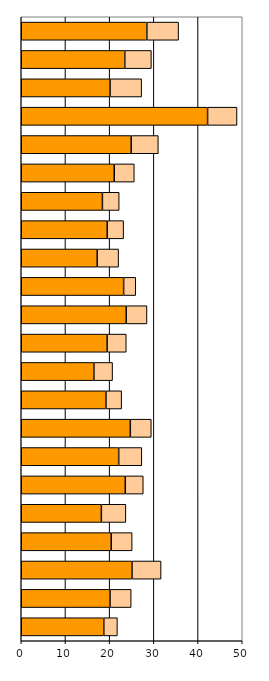
| Category | Series 0 | Series 1 |
|---|---|---|
| 0 | 18.677 | 3.075 |
| 1 | 20.083 | 4.787 |
| 2 | 25.054 | 6.58 |
| 3 | 20.36 | 4.727 |
| 4 | 18.124 | 5.546 |
| 5 | 23.538 | 4.071 |
| 6 | 22.045 | 5.237 |
| 7 | 24.676 | 4.745 |
| 8 | 19.166 | 3.543 |
| 9 | 16.444 | 4.22 |
| 10 | 19.428 | 4.334 |
| 11 | 23.743 | 4.7 |
| 12 | 23.162 | 2.741 |
| 13 | 17.182 | 4.839 |
| 14 | 19.446 | 3.713 |
| 15 | 18.363 | 3.795 |
| 16 | 21.042 | 4.531 |
| 17 | 24.87 | 6.141 |
| 18 | 42.159 | 6.657 |
| 19 | 20.09 | 7.149 |
| 20 | 23.422 | 6.02 |
| 21 | 28.42 | 7.175 |